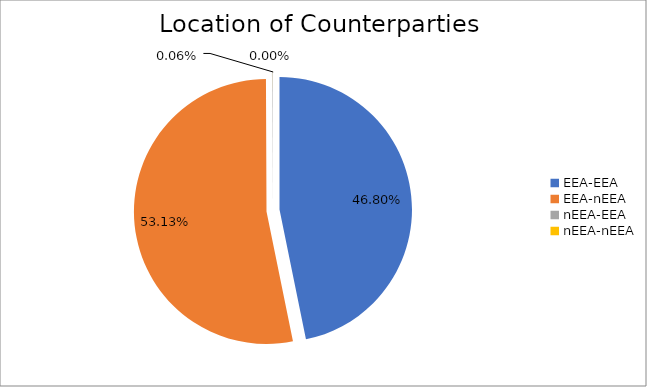
| Category | Series 0 |
|---|---|
| EEA-EEA | 6089911.946 |
| EEA-nEEA | 6913956.996 |
| nEEA-EEA | 8075.002 |
| nEEA-nEEA | 493.984 |